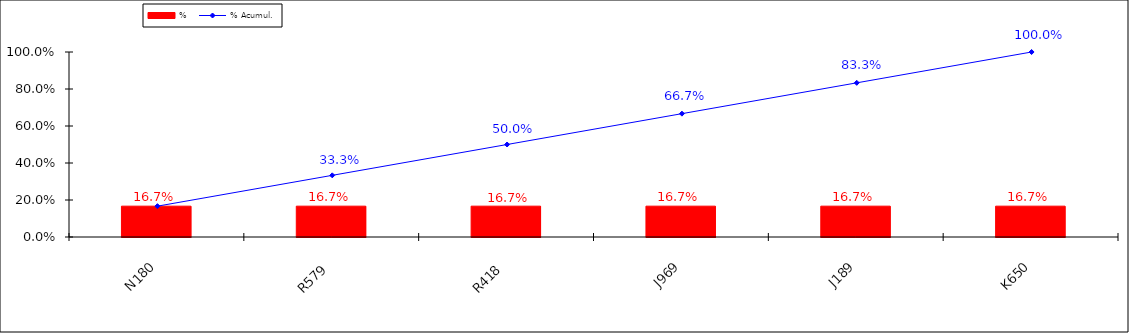
| Category | % |
|---|---|
| N180 | 0.167 |
| R579 | 0.167 |
| R418 | 0.167 |
| J969 | 0.167 |
| J189 | 0.167 |
| K650 | 0.167 |